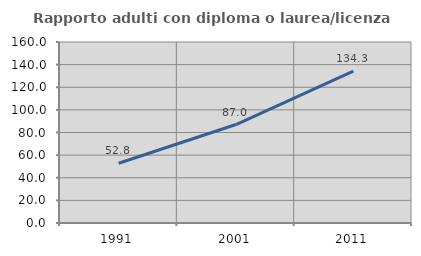
| Category | Rapporto adulti con diploma o laurea/licenza media  |
|---|---|
| 1991.0 | 52.783 |
| 2001.0 | 87.044 |
| 2011.0 | 134.337 |